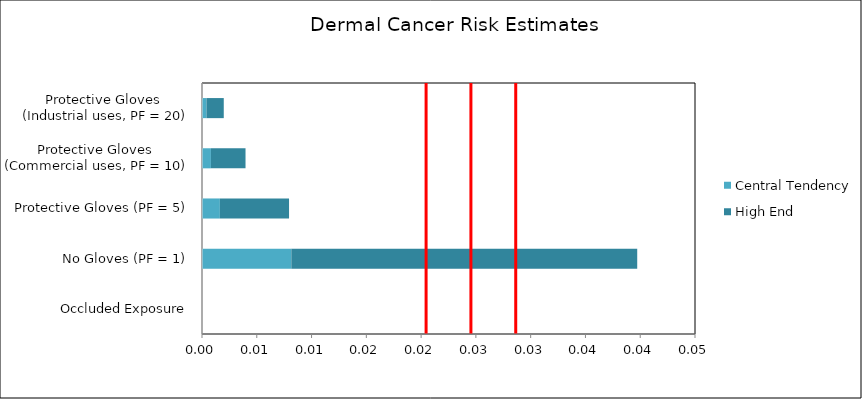
| Category | Central Tendency | High End |
|---|---|---|
| Occluded Exposure | 0 | 0 |
| No Gloves (PF = 1) | 0.008 | 0.032 |
| Protective Gloves (PF = 5) | 0.002 | 0.006 |
| Protective Gloves 
(Commercial uses, PF = 10) | 0.001 | 0.003 |
| Protective Gloves 
(Industrial uses, PF = 20) | 0 | 0.002 |